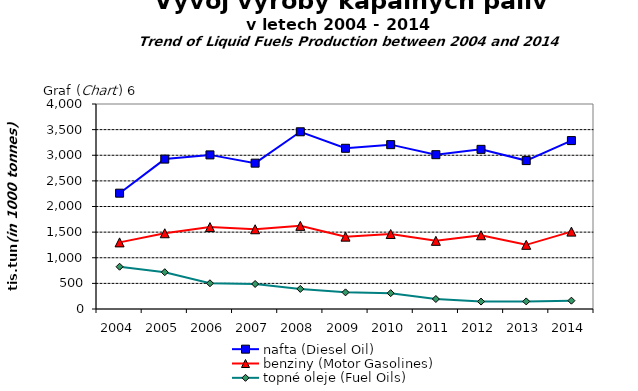
| Category | nafta (Diesel Oil) | benziny (Motor Gasolines) | topné oleje (Fuel Oils) |
|---|---|---|---|
| 2004.0 | 2260 | 1300 | 825 |
| 2005.0 | 2925 | 1478 | 718 |
| 2006.0 | 3007 | 1598 | 502 |
| 2007.0 | 2846 | 1556 | 488 |
| 2008.0 | 3458 | 1622 | 392 |
| 2009.0 | 3135.727 | 1412 | 324.452 |
| 2010.0 | 3207 | 1463 | 309 |
| 2011.0 | 3011 | 1330 | 195 |
| 2012.0 | 3115 | 1439 | 145 |
| 2013.0 | 2896 | 1252 | 148 |
| 2014.0 | 3286.263 | 1509.772 | 162.611 |